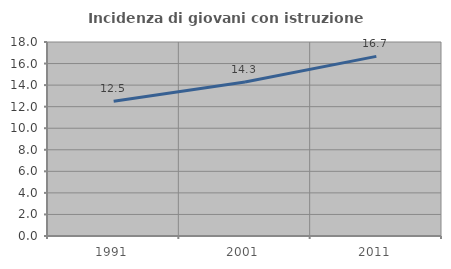
| Category | Incidenza di giovani con istruzione universitaria |
|---|---|
| 1991.0 | 12.5 |
| 2001.0 | 14.286 |
| 2011.0 | 16.667 |